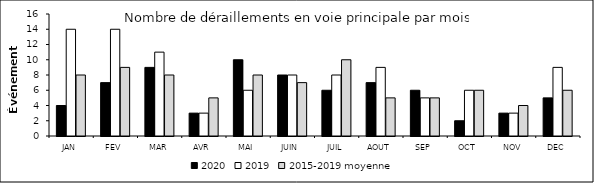
| Category | 2020 | 2019 | 2015-2019 moyenne |
|---|---|---|---|
| JAN | 4 | 14 | 8 |
| FEV | 7 | 14 | 9 |
| MAR | 9 | 11 | 8 |
| AVR | 3 | 3 | 5 |
| MAI | 10 | 6 | 8 |
| JUIN | 8 | 8 | 7 |
| JUIL | 6 | 8 | 10 |
| AOUT | 7 | 9 | 5 |
| SEP | 6 | 5 | 5 |
| OCT | 2 | 6 | 6 |
| NOV | 3 | 3 | 4 |
| DEC | 5 | 9 | 6 |